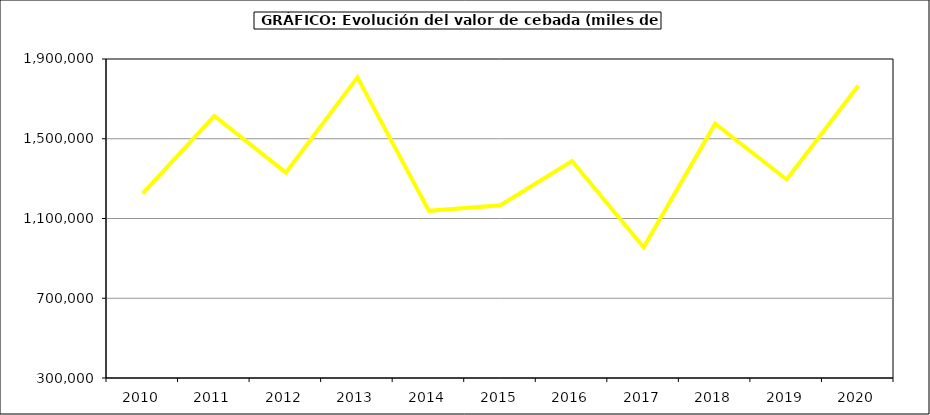
| Category | Valor |
|---|---|
| 2010.0 | 1225605.118 |
| 2011.0 | 1614321.82 |
| 2012.0 | 1330052.285 |
| 2013.0 | 1807903.139 |
| 2014.0 | 1138276.107 |
| 2015.0 | 1166688 |
| 2016.0 | 1388353 |
| 2017.0 | 955259.354 |
| 2018.0 | 1575757.741 |
| 2019.0 | 1295734.047 |
| 2020.0 | 1766071.736 |